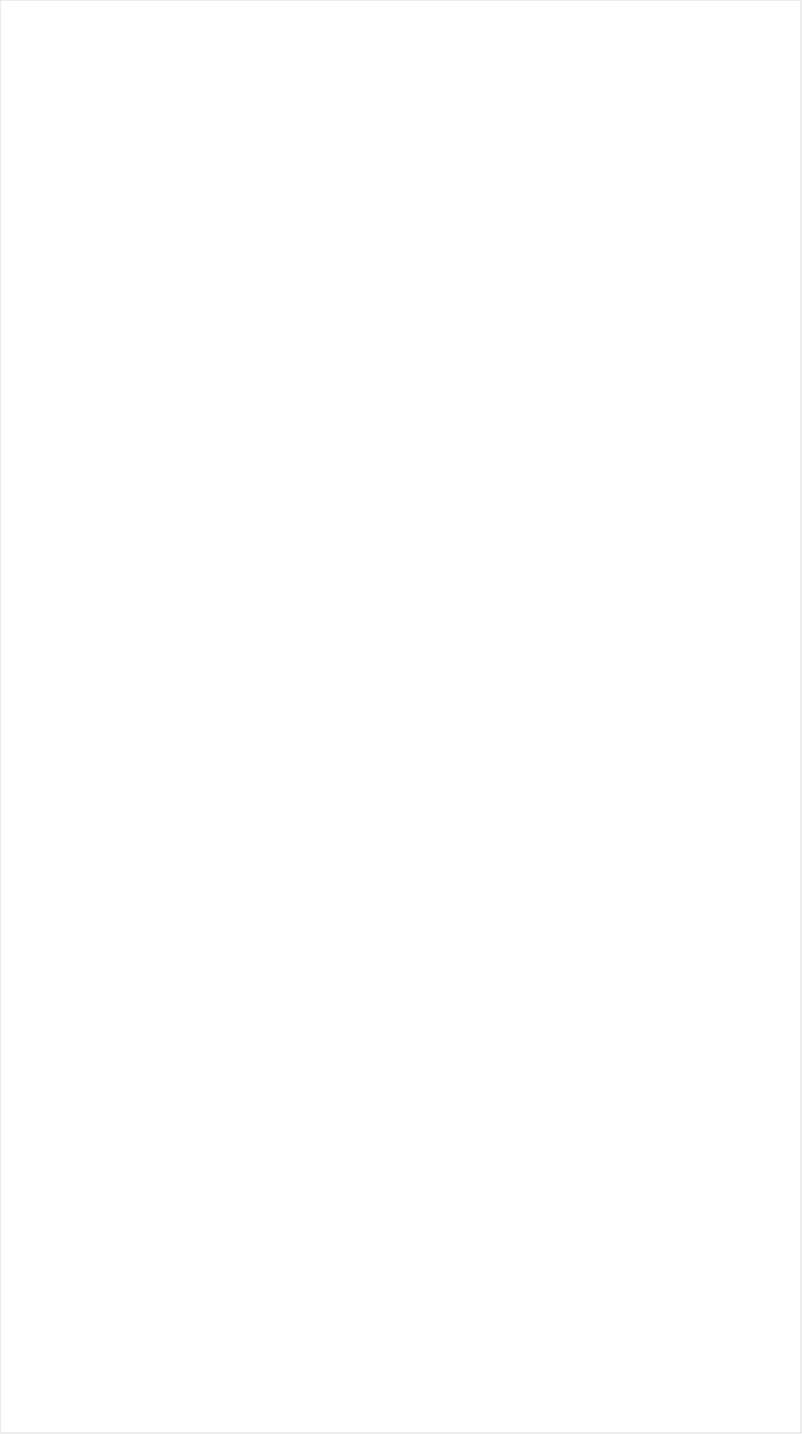
| Category | Total |
|---|---|
| Galavision | -0.95 |
| Univision | -0.868 |
| UniMas | -0.861 |
| Telemundo | -0.843 |
| NBC Universo | -0.802 |
| TUDN | -0.795 |
| BET | -0.704 |
| TV ONE | -0.658 |
| Cartoon Network | -0.637 |
| VH1 | -0.609 |
| BET Her | -0.608 |
| Nick Toons | -0.563 |
| Logo | -0.561 |
| Teen Nick | -0.556 |
| Disney XD | -0.544 |
| Disney Channel | -0.486 |
| Nick | -0.478 |
| Adult Swim | -0.477 |
| Lifetime Movies | -0.472 |
| Nick Jr. | -0.452 |
| WE TV | -0.386 |
| TLC | -0.376 |
| Oprah Winfrey Network | -0.367 |
| Disney Junior US | -0.365 |
| Discovery Life Channel | -0.36 |
| Travel | -0.353 |
| Universal Kids | -0.345 |
| Lifetime | -0.326 |
| MTV2 | -0.293 |
| OXYGEN | -0.279 |
| Investigation Discovery | -0.279 |
| Nick@Nite | -0.265 |
| UP TV | -0.26 |
| MTV | -0.242 |
| USA Network | -0.228 |
| FXX | -0.227 |
| Freeform | -0.216 |
| Discovery Family Channel | -0.209 |
| A&E | -0.196 |
| Hallmark | -0.157 |
| POP | -0.125 |
| ION | -0.113 |
| Viceland | -0.112 |
| FX | -0.106 |
| SYFY | -0.104 |
| E! | -0.064 |
| CMTV | -0.061 |
| Hallmark Movies & Mysteries | -0.06 |
| INSP | -0.045 |
| CW | -0.04 |
| FX Movie Channel | -0.037 |
| Great American Country | -0.011 |
| Ovation | -0.009 |
| Paramount Network | -0.006 |
| TNT | 0.016 |
| BRAVO | 0.028 |
| Comedy Central | 0.033 |
| Science Channel | 0.038 |
| Reelz Channel | 0.045 |
| TV LAND | 0.049 |
| TBS | 0.053 |
| Game Show | 0.056 |
| FOX | 0.058 |
| Discovery Channel | 0.084 |
| Animal Planet | 0.09 |
| National Geographic Wild | 0.095 |
| CNN | 0.1 |
| American Heroes Channel | 0.112 |
| MSNBC | 0.115 |
| Motor Trend Network | 0.116 |
| BBC America | 0.14 |
| HGTV | 0.143 |
| Weather Channel | 0.157 |
| Headline News | 0.157 |
| Food Network | 0.162 |
| AMC | 0.178 |
| SundanceTV | 0.184 |
| FYI | 0.187 |
| RFD TV | 0.196 |
| WGN America | 0.213 |
| ABC | 0.244 |
| NBA TV | 0.247 |
| Cooking Channel | 0.253 |
| National Geographic | 0.279 |
| Destination America | 0.289 |
| History Channel | 0.3 |
| truTV | 0.305 |
| Independent Film (IFC) | 0.329 |
| DIY | 0.352 |
| NBC | 0.366 |
| Smithsonian | 0.371 |
| CNBC | 0.413 |
| Fox News | 0.426 |
| CBS | 0.427 |
| MyNetworkTV | 0.436 |
| ESPN Deportes | 0.472 |
| Olympic Channel | 0.54 |
| NFL Network | 0.551 |
| FXDEP | 0.582 |
| PBS | 0.607 |
| Bloomberg HD | 0.636 |
| The Sportsman Channel | 0.679 |
| Outdoor Channel | 0.682 |
| Fox Business | 0.734 |
| Fox Sports 1 | 0.757 |
| ESPNEWS | 0.778 |
| ESPN | 0.829 |
| NBC Sports | 0.933 |
| ESPNU | 0.951 |
| MLB Network | 1.015 |
| FOX Sports 2 | 1.024 |
| Tennis Channel | 1.115 |
| ESPN2 | 1.174 |
| Big Ten Network | 1.206 |
| NHL | 1.39 |
| CBS Sports | 1.462 |
| PAC-12 Network | 1.749 |
| Golf | 5.928 |